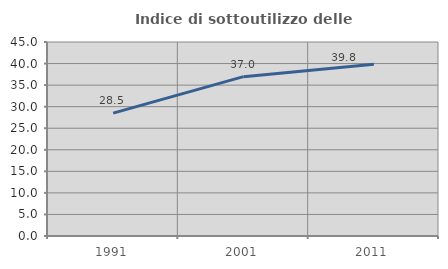
| Category | Indice di sottoutilizzo delle abitazioni  |
|---|---|
| 1991.0 | 28.495 |
| 2001.0 | 36.957 |
| 2011.0 | 39.823 |